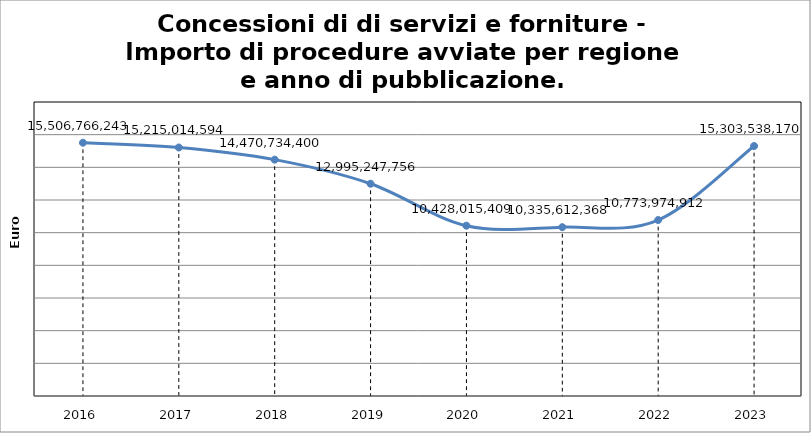
| Category | Series 0 |
|---|---|
| 2016.0 | 15506766243 |
| 2017.0 | 15215014594 |
| 2018.0 | 14470734400 |
| 2019.0 | 12995247756 |
| 2020.0 | 10428015409 |
| 2021.0 | 10335612368 |
| 2022.0 | 10773974912 |
| 2023.0 | 15303538170 |